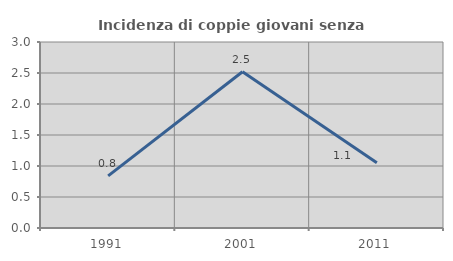
| Category | Incidenza di coppie giovani senza figli |
|---|---|
| 1991.0 | 0.84 |
| 2001.0 | 2.521 |
| 2011.0 | 1.053 |